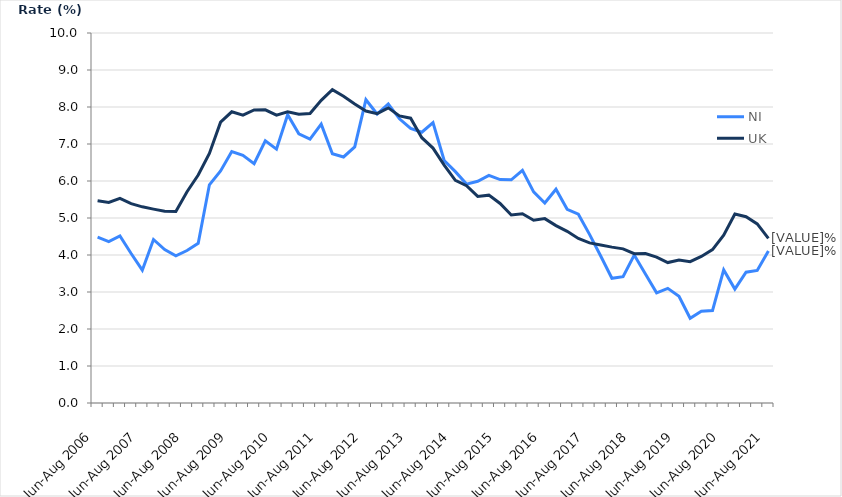
| Category | NI | UK |
|---|---|---|
| Jun-Aug 2006 | 4.482 | 5.467 |
| Sep-Nov 2006 | 4.361 | 5.42 |
| Dec-Feb 2007 | 4.516 | 5.53 |
| Mar-May 2007 | 4.04 | 5.389 |
| Jun-Aug 2007 | 3.589 | 5.302 |
| Sep-Nov 2007 | 4.419 | 5.239 |
| Dec-Feb 2008 | 4.146 | 5.181 |
| Mar-May 2008 | 3.979 | 5.179 |
| Jun-Aug 2008 | 4.122 | 5.71 |
| Sep-Nov 2008 | 4.317 | 6.163 |
| Dec-Feb 2009 | 5.897 | 6.744 |
| Mar-May 2009 | 6.27 | 7.59 |
| Jun-Aug 2009 | 6.796 | 7.87 |
| Sep-Nov 2009 | 6.693 | 7.781 |
| Dec-Feb 2010 | 6.47 | 7.92 |
| Mar-May 2010 | 7.085 | 7.923 |
| Jun-Aug 2010 | 6.862 | 7.782 |
| Sep-Nov 2010 | 7.791 | 7.871 |
| Dec-Feb 2011 | 7.277 | 7.803 |
| Mar-May 2011 | 7.133 | 7.822 |
| Jun-Aug 2011 | 7.538 | 8.181 |
| Sep-Nov 2011 | 6.736 | 8.467 |
| Dec-Feb 2012 | 6.65 | 8.289 |
| Mar-May 2012 | 6.922 | 8.08 |
| Jun-Aug 2012 | 8.196 | 7.89 |
| Sep-Nov 2012 | 7.81 | 7.82 |
| Dec-Feb 2013 | 8.083 | 7.976 |
| Mar-May 2013 | 7.68 | 7.758 |
| Jun-Aug 2013 | 7.422 | 7.698 |
| Sep-Nov 2013 | 7.318 | 7.17 |
| Dec-Feb 2014 | 7.578 | 6.889 |
| Mar-May 2014 | 6.554 | 6.428 |
| Jun-Aug 2014 | 6.253 | 6.019 |
| Sep-Nov 2014 | 5.916 | 5.871 |
| Dec-Feb 2015 | 5.991 | 5.583 |
| Mar-May 2015 | 6.154 | 5.617 |
| Jun-Aug 2015 | 6.039 | 5.392 |
| Sep-Nov 2015 | 6.033 | 5.081 |
| Dec-Feb 2016 | 6.288 | 5.113 |
| Mar-May 2016 | 5.706 | 4.939 |
| Jun-Aug 2016 | 5.404 | 4.983 |
| Sep-Nov 2016 | 5.778 | 4.794 |
| Dec-Feb 2017 | 5.235 | 4.64 |
| Mar-May 2017 | 5.102 | 4.445 |
| Jun-Aug 2017 | 4.558 | 4.328 |
| Sep-Nov 2017 | 3.974 | 4.272 |
| Dec-Feb 2018 | 3.371 | 4.213 |
| Mar-May 2018 | 3.416 | 4.165 |
| Jun-Aug 2018 | 3.999 | 4.035 |
| Sep-Nov 2018 | 3.486 | 4.039 |
| Dec-Feb 2019 | 2.979 | 3.942 |
| Mar-May 2019 | 3.099 | 3.796 |
| Jun-Aug 2019 | 2.886 | 3.863 |
| Sep-Nov 2019 | 2.289 | 3.819 |
| Dec-Feb 2020 | 2.483 | 3.961 |
| Mar-May 2020 | 2.498 | 4.147 |
| Jun-Aug 2020 | 3.598 | 4.538 |
| Sep-Nov 2020 | 3.079 | 5.107 |
| Dec-Feb 2021 | 3.537 | 5.035 |
| Mar-May 2021 | 3.582 | 4.839 |
| Jun-Aug 2021 | 4.11 | 4.451 |